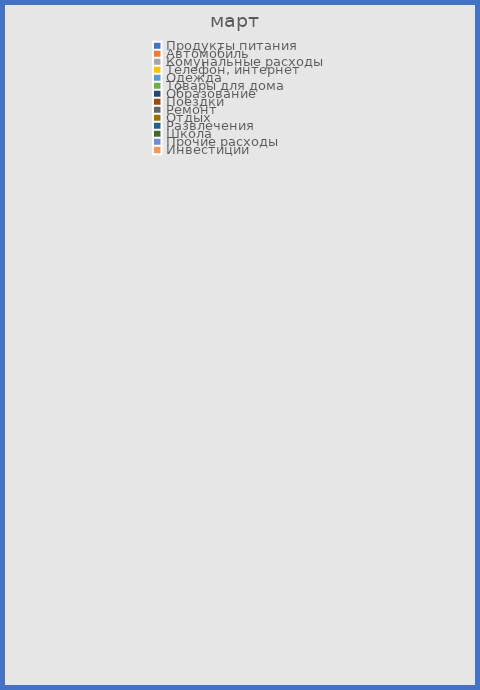
| Category | Series 0 |
|---|---|
| Продукты питания | 0 |
| Автомобиль | 0 |
| Комунальные расходы | 0 |
| Телефон, интернет | 0 |
| Одежда | 0 |
| Товары для дома | 0 |
| Образование | 0 |
| Поездки | 0 |
| Ремонт | 0 |
| Отдых | 0 |
| Развлечения | 0 |
| Школа | 0 |
| Прочие расходы | 0 |
| Инвестиции | 0 |